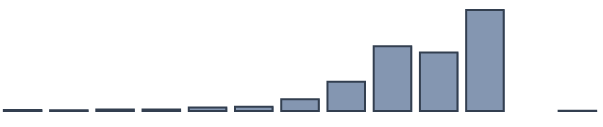
| Category | Series 0 |
|---|---|
| 0 | 0.4 |
| 1 | 0.3 |
| 2 | 0.5 |
| 3 | 0.5 |
| 4 | 1.3 |
| 5 | 1.5 |
| 6 | 4.2 |
| 7 | 10.5 |
| 8 | 23.3 |
| 9 | 21.1 |
| 10 | 36.4 |
| 11 | 0 |
| 12 | 0.1 |